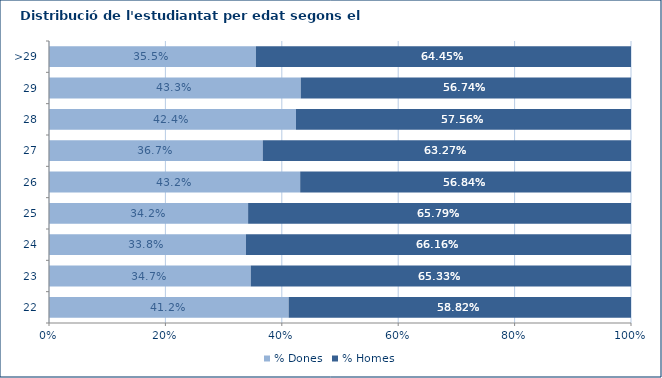
| Category | % Dones | % Homes |
|---|---|---|
| 22 | 0.412 | 0.588 |
| 23 | 0.347 | 0.653 |
| 24 | 0.338 | 0.662 |
| 25 | 0.342 | 0.658 |
| 26 | 0.432 | 0.568 |
| 27 | 0.367 | 0.633 |
| 28 | 0.424 | 0.576 |
| 29 | 0.433 | 0.567 |
| >29 | 0.355 | 0.645 |